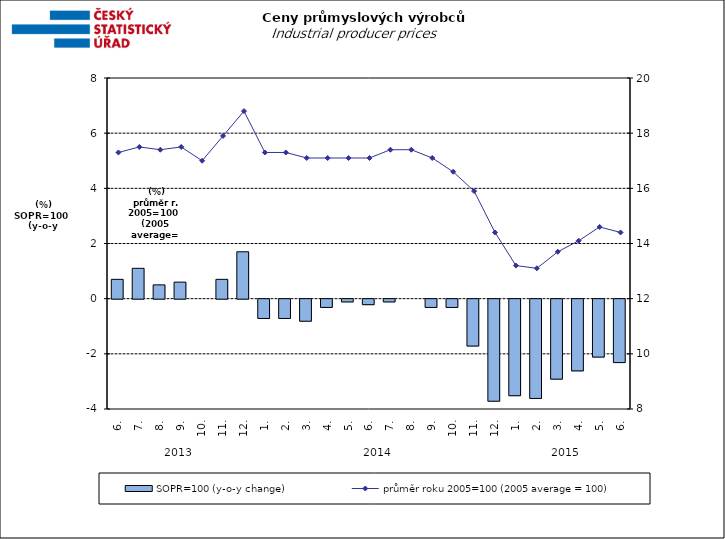
| Category | SOPR=100 (y-o-y change)   |
|---|---|
| 0 | 0.7 |
| 1 | 1.1 |
| 2 | 0.5 |
| 3 | 0.6 |
| 4 | 0 |
| 5 | 0.7 |
| 6 | 1.7 |
| 7 | -0.7 |
| 8 | -0.7 |
| 9 | -0.8 |
| 10 | -0.3 |
| 11 | -0.1 |
| 12 | -0.2 |
| 13 | -0.1 |
| 14 | 0 |
| 15 | -0.3 |
| 16 | -0.3 |
| 17 | -1.7 |
| 18 | -3.7 |
| 19 | -3.5 |
| 20 | -3.6 |
| 21 | -2.9 |
| 22 | -2.6 |
| 23 | -2.1 |
| 24 | -2.3 |